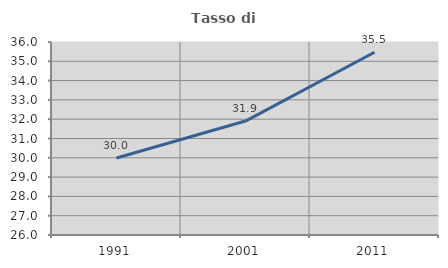
| Category | Tasso di occupazione   |
|---|---|
| 1991.0 | 29.991 |
| 2001.0 | 31.904 |
| 2011.0 | 35.47 |